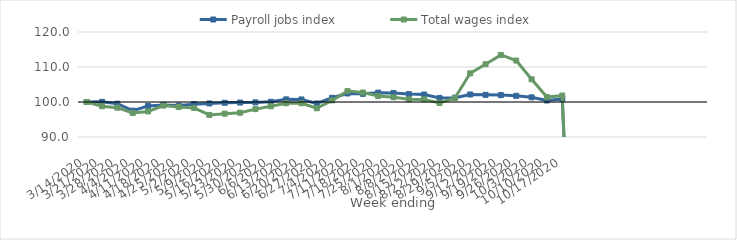
| Category | Payroll jobs index | Total wages index |
|---|---|---|
| 14/03/2020 | 100 | 100 |
| 21/03/2020 | 100.041 | 98.8 |
| 28/03/2020 | 99.526 | 98.377 |
| 04/04/2020 | 97.523 | 96.879 |
| 11/04/2020 | 98.858 | 97.306 |
| 18/04/2020 | 99.113 | 98.996 |
| 25/04/2020 | 98.968 | 98.554 |
| 02/05/2020 | 99.389 | 98.31 |
| 09/05/2020 | 99.584 | 96.311 |
| 16/05/2020 | 99.78 | 96.67 |
| 23/05/2020 | 99.84 | 96.947 |
| 30/05/2020 | 99.891 | 97.97 |
| 06/06/2020 | 100.051 | 98.779 |
| 13/06/2020 | 100.753 | 99.648 |
| 20/06/2020 | 100.731 | 99.654 |
| 27/06/2020 | 99.594 | 98.216 |
| 04/07/2020 | 101.2 | 100.45 |
| 11/07/2020 | 102.439 | 103.109 |
| 18/07/2020 | 102.332 | 102.71 |
| 25/07/2020 | 102.672 | 101.741 |
| 01/08/2020 | 102.557 | 101.361 |
| 08/08/2020 | 102.261 | 100.772 |
| 15/08/2020 | 102.134 | 100.747 |
| 22/08/2020 | 101.139 | 99.742 |
| 29/08/2020 | 101.242 | 101.131 |
| 05/09/2020 | 102.147 | 108.196 |
| 12/09/2020 | 102.048 | 110.784 |
| 19/09/2020 | 101.971 | 113.44 |
| 26/09/2020 | 101.768 | 111.847 |
| 03/10/2020 | 101.33 | 106.498 |
| 10/10/2020 | 100.421 | 101.402 |
| 17/10/2020 | 100.887 | 101.847 |